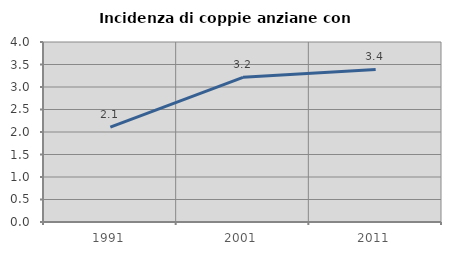
| Category | Incidenza di coppie anziane con figli |
|---|---|
| 1991.0 | 2.109 |
| 2001.0 | 3.214 |
| 2011.0 | 3.391 |